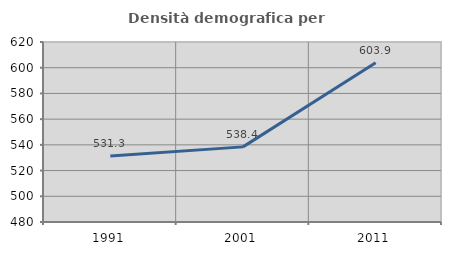
| Category | Densità demografica |
|---|---|
| 1991.0 | 531.275 |
| 2001.0 | 538.43 |
| 2011.0 | 603.882 |